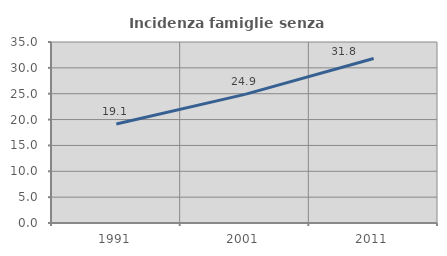
| Category | Incidenza famiglie senza nuclei |
|---|---|
| 1991.0 | 19.132 |
| 2001.0 | 24.869 |
| 2011.0 | 31.801 |